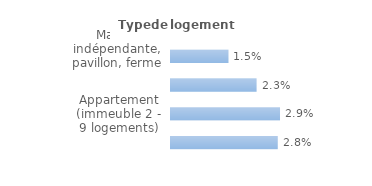
| Category | Series 0 |
|---|---|
| Maison indépendante, pavillon, ferme | 0.015 |
| Maison de ville groupée | 0.023 |
| Appartement (immeuble 2 - 9 logements) | 0.029 |
| Appartement (immeuble de 10 logements ou +) | 0.028 |